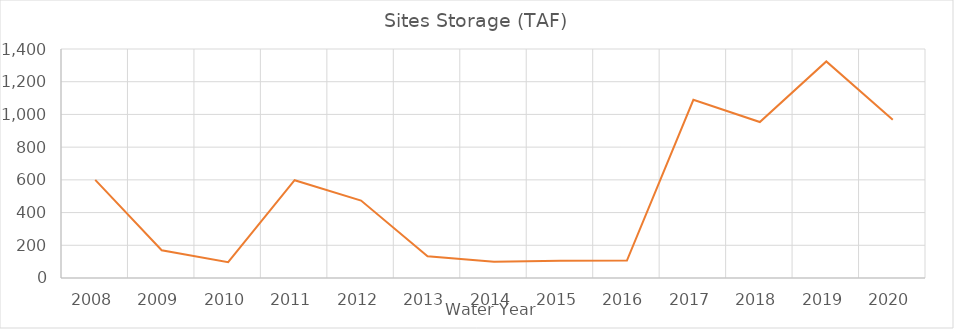
| Category | Storage (TAF) |
|---|---|
| 2008.0 | 600 |
| 2009.0 | 169.547 |
| 2010.0 | 97.038 |
| 2011.0 | 598.036 |
| 2012.0 | 473.23 |
| 2013.0 | 133.415 |
| 2014.0 | 99.061 |
| 2015.0 | 105.565 |
| 2016.0 | 106.262 |
| 2017.0 | 1089.375 |
| 2018.0 | 953.504 |
| 2019.0 | 1323.84 |
| 2020.0 | 968.133 |